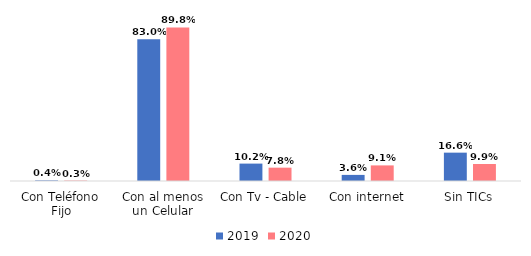
| Category | 2019 | 2020 |
|---|---|---|
| Con Teléfono Fijo | 0.004 | 0.003 |
| Con al menos un Celular | 0.83 | 0.898 |
| Con Tv - Cable | 0.102 | 0.078 |
| Con internet | 0.036 | 0.091 |
| Sin TICs | 0.166 | 0.099 |